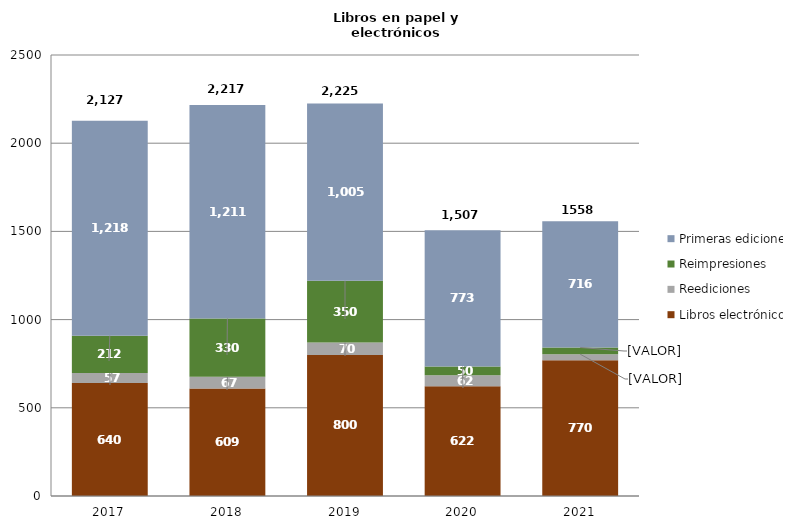
| Category | Libros electrónicos | Reediciones | Reimpresiones | Primeras ediciones |
|---|---|---|---|---|
| 2017.0 | 640 | 57 | 212 | 1218 |
| 2018.0 | 609 | 67 | 330 | 1211 |
| 2019.0 | 800 | 70 | 350 | 1005 |
| 2020.0 | 622 | 62 | 50 | 773 |
| 2021.0 | 770 | 34 | 38 | 716 |